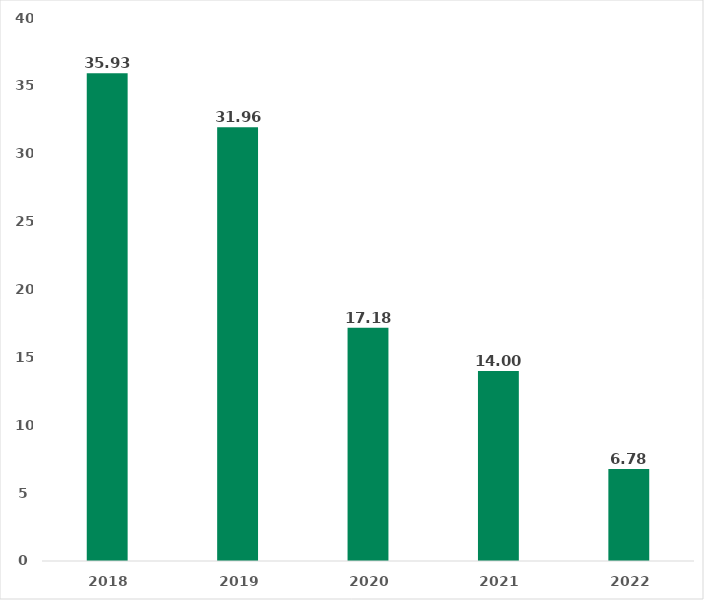
| Category | Waiting Time, Days |
|---|---|
| 2018.0 | 35.93 |
| 2019.0 | 31.96 |
| 2020.0 | 17.18 |
| 2021.0 | 14 |
| 2022.0 | 6.78 |